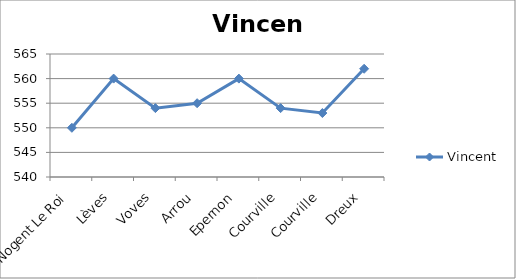
| Category | Vincent |
|---|---|
| Nogent Le Roi | 550 |
| Lèves | 560 |
| Voves | 554 |
| Arrou | 555 |
| Epernon | 560 |
| Courville | 554 |
| Courville | 553 |
| Dreux | 562 |